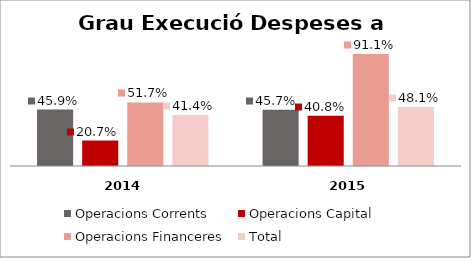
| Category | Operacions Corrents | Operacions Capital | Operacions Financeres | Total |
|---|---|---|---|---|
| 0 | 0.459 | 0.207 | 0.517 | 0.414 |
| 1 | 0.457 | 0.408 | 0.911 | 0.481 |